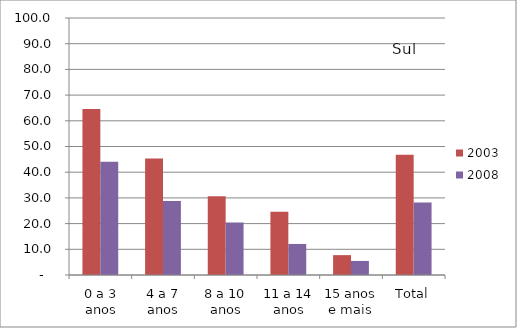
| Category | 2003 | 2008 |
|---|---|---|
| 0 a 3 anos | 64.55 | 44.08 |
| 4 a 7 anos | 45.33 | 28.78 |
| 8 a 10 anos | 30.66 | 20.46 |
| 11 a 14 anos | 24.59 | 12.08 |
| 15 anos e mais | 7.73 | 5.47 |
| Total | 46.78 | 28.19 |